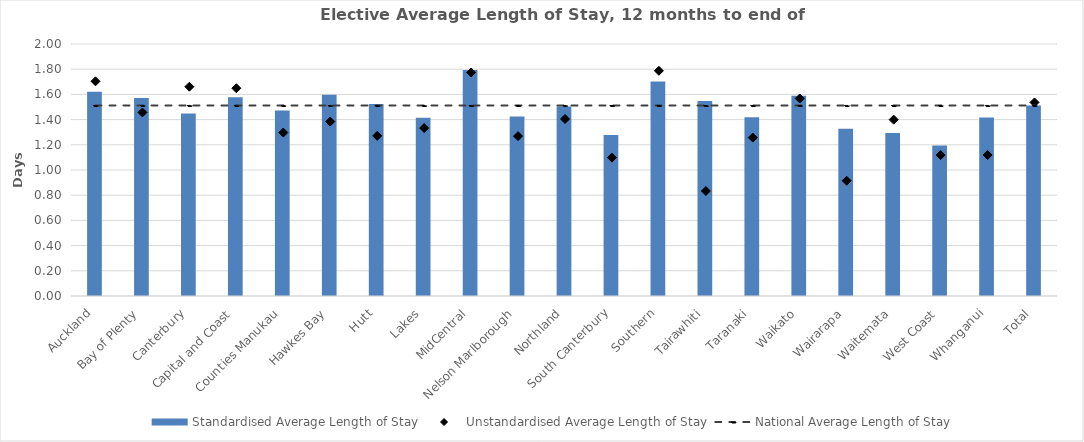
| Category | Standardised Average Length of Stay |
|---|---|
| Auckland | 1.621 |
| Bay of Plenty | 1.571 |
| Canterbury | 1.448 |
| Capital and Coast | 1.578 |
| Counties Manukau | 1.472 |
| Hawkes Bay | 1.597 |
| Hutt | 1.524 |
| Lakes | 1.415 |
| MidCentral | 1.794 |
| Nelson Marlborough | 1.424 |
| Northland | 1.503 |
| South Canterbury | 1.278 |
| Southern | 1.702 |
| Tairawhiti | 1.547 |
| Taranaki | 1.419 |
| Waikato | 1.589 |
| Wairarapa | 1.327 |
| Waitemata | 1.293 |
| West Coast | 1.195 |
| Whanganui | 1.418 |
| Total | 1.512 |